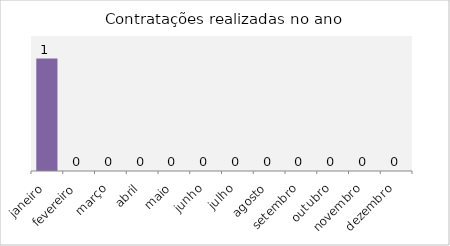
| Category | Contratações realizadas no ano |
|---|---|
| janeiro | 1 |
| fevereiro | 0 |
| março | 0 |
| abril | 0 |
| maio | 0 |
| junho | 0 |
| julho | 0 |
| agosto | 0 |
| setembro | 0 |
| outubro | 0 |
| novembro | 0 |
| dezembro | 0 |